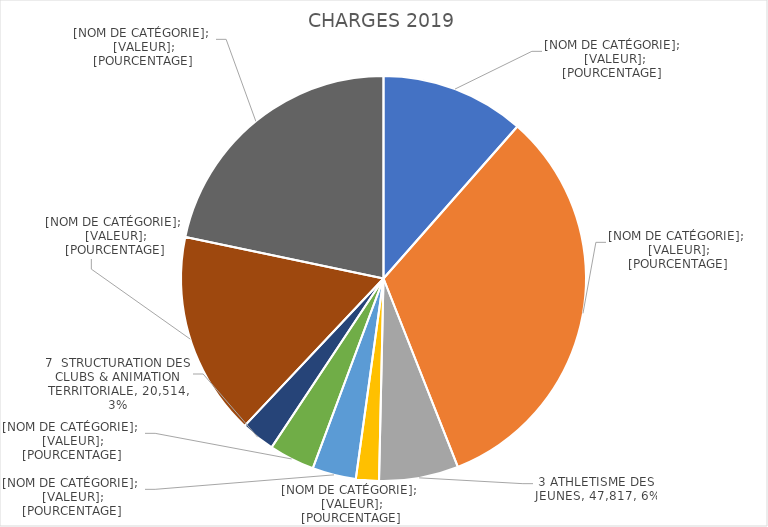
| Category | Series 0 |
|---|---|
| 1 ATHLETISME COMPETITION | 86734.829 |
| 2 SUIVI ATHLETES | 245519.341 |
| 3 ATHLETISME DES JEUNES | 47817.045 |
| 4 ATHLE RUNNING | 13844.456 |
| 5 ATHLE SANTE LOISIRS | 26331.272 |
| 6 FORMATIONS | 27460.006 |
| 7  STRUCTURATION DES CLUBS & ANIMATION TERRITORIALE | 20514.118 |
| 8 STRUCTURE REGIONALE | 122720.89 |
| 9 ADMINISTRATION | 163894.042 |